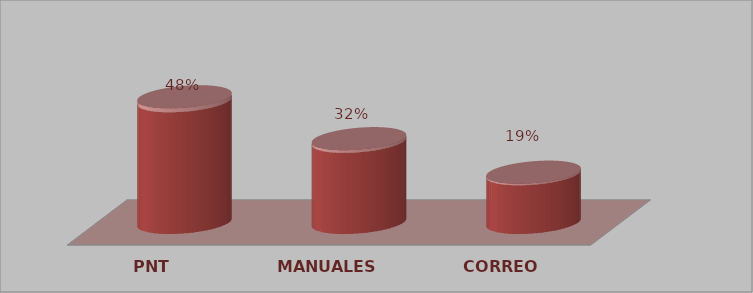
| Category | Series 0 | Series 1 |
|---|---|---|
| PNT | 15 | 0.484 |
| MANUALES | 10 | 0.323 |
| CORREO | 6 | 0.194 |